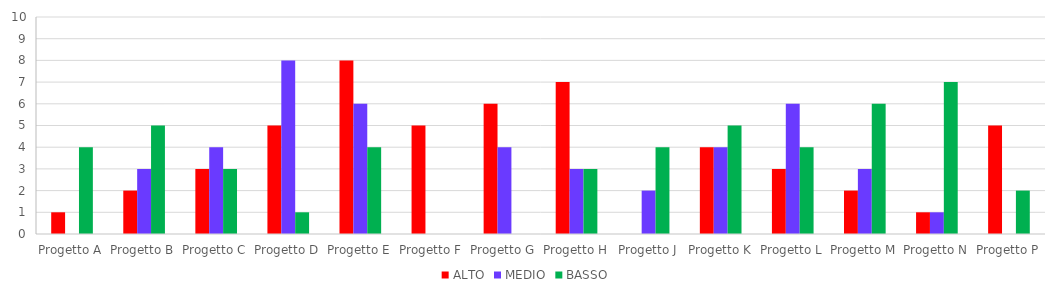
| Category | ALTO | MEDIO | BASSO |
|---|---|---|---|
| Progetto A | 1 | 0 | 4 |
| Progetto B | 2 | 3 | 5 |
| Progetto C | 3 | 4 | 3 |
| Progetto D | 5 | 8 | 1 |
| Progetto E | 8 | 6 | 4 |
| Progetto F | 5 | 0 | 0 |
| Progetto G | 6 | 4 | 0 |
| Progetto H | 7 | 3 | 3 |
| Progetto J | 0 | 2 | 4 |
| Progetto K | 4 | 4 | 5 |
| Progetto L | 3 | 6 | 4 |
| Progetto M | 2 | 3 | 6 |
| Progetto N | 1 | 1 | 7 |
| Progetto P | 5 | 0 | 2 |